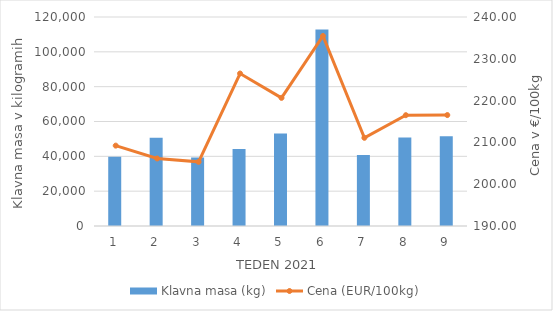
| Category | Klavna masa (kg) |
|---|---|
| 1.0 | 39814 |
| 2.0 | 50603 |
| 3.0 | 39295 |
| 4.0 | 44250 |
| 5.0 | 53061 |
| 6.0 | 112816 |
| 7.0 | 40829 |
| 8.0 | 50775 |
| 9.0 | 51535 |